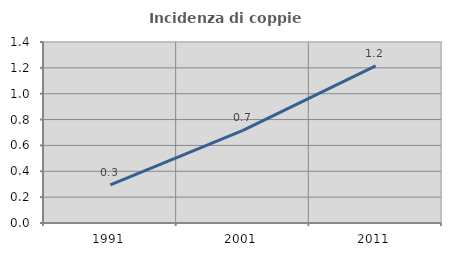
| Category | Incidenza di coppie miste |
|---|---|
| 1991.0 | 0.294 |
| 2001.0 | 0.716 |
| 2011.0 | 1.215 |